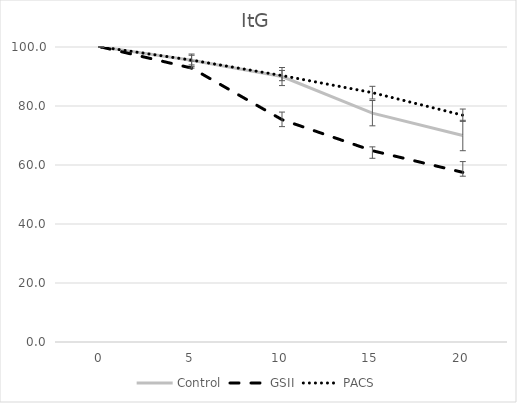
| Category | Control | GSII | PACS |
|---|---|---|---|
| 0.0 | 100 | 100 | 100 |
| 5.0 | 95.525 | 92.852 | 95.556 |
| 10.0 | 89.989 | 75.379 | 90.319 |
| 15.0 | 77.568 | 64.84 | 84.528 |
| 20.0 | 69.997 | 57.505 | 76.878 |